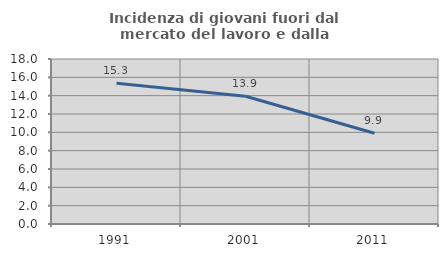
| Category | Incidenza di giovani fuori dal mercato del lavoro e dalla formazione  |
|---|---|
| 1991.0 | 15.344 |
| 2001.0 | 13.936 |
| 2011.0 | 9.899 |